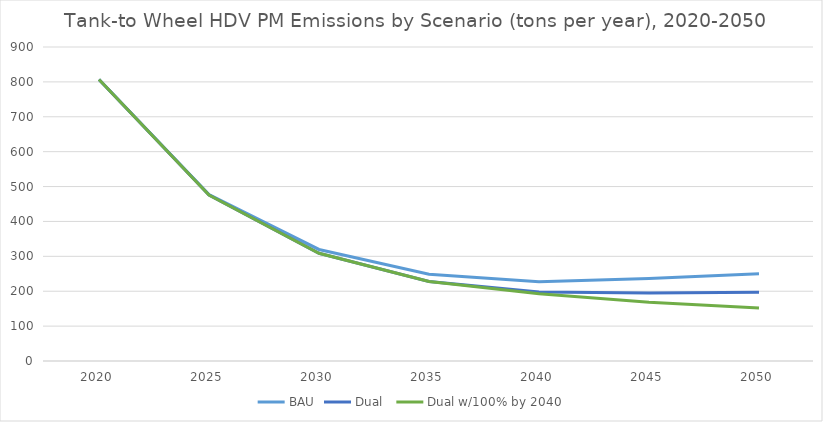
| Category | BAU | Dual  | Dual w/100% by 2040 |
|---|---|---|---|
| 2020.0 | 806.776 | 806.776 | 806.776 |
| 2025.0 | 477.311 | 475.622 | 475.622 |
| 2030.0 | 319.724 | 308.822 | 308.822 |
| 2035.0 | 248.56 | 227.872 | 227.872 |
| 2040.0 | 227.005 | 197.947 | 192.873 |
| 2045.0 | 236.608 | 194.736 | 168.73 |
| 2050.0 | 250.08 | 196.872 | 151.79 |